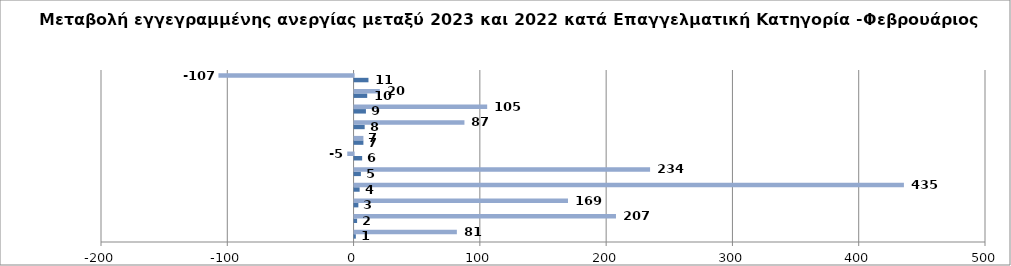
| Category | Series 0 | Series 1 |
|---|---|---|
| 0 | 1 | 81 |
| 1 | 2 | 207 |
| 2 | 3 | 169 |
| 3 | 4 | 435 |
| 4 | 5 | 234 |
| 5 | 6 | -5 |
| 6 | 7 | 7 |
| 7 | 8 | 87 |
| 8 | 9 | 105 |
| 9 | 10 | 20 |
| 10 | 11 | -107 |